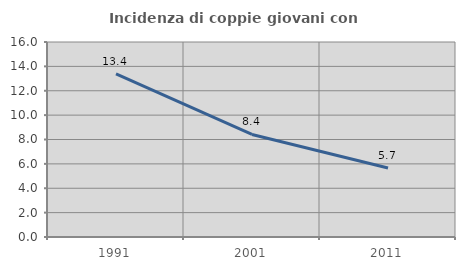
| Category | Incidenza di coppie giovani con figli |
|---|---|
| 1991.0 | 13.375 |
| 2001.0 | 8.413 |
| 2011.0 | 5.658 |